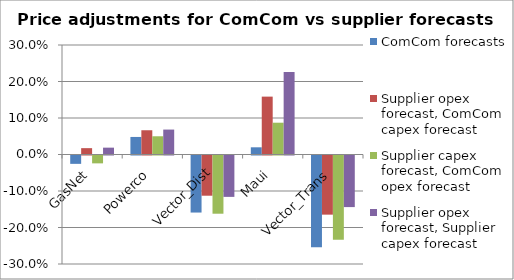
| Category | ComCom forecasts | Supplier opex forecast, ComCom capex forecast | Supplier capex forecast, ComCom opex forecast | Supplier opex forecast, Supplier capex forecast |
|---|---|---|---|---|
| GasNet | -0.023 | 0.017 | -0.022 | 0.019 |
| Powerco | 0.048 | 0.066 | 0.05 | 0.068 |
| Vector_Dist | -0.156 | -0.11 | -0.159 | -0.113 |
| Maui | 0.02 | 0.159 | 0.087 | 0.226 |
| Vector_Trans | -0.252 | -0.162 | -0.231 | -0.141 |